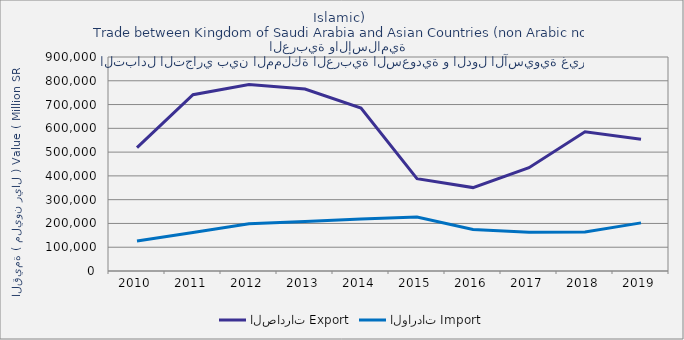
| Category | الصادرات | الواردات |
|---|---|---|
| 2010.0 | 518558255953 | 126340214000 |
| 2011.0 | 741564088895 | 161858633935 |
| 2012.0 | 784396925075 | 198437718217 |
| 2013.0 | 765253434045 | 207926807414 |
| 2014.0 | 685488904447 | 218830075159 |
| 2015.0 | 388133411072 | 227280076573 |
| 2016.0 | 350738691172 | 174404286684 |
| 2017.0 | 434618930097 | 162681670861 |
| 2018.0 | 585406686743 | 164250966196 |
| 2019.0 | 553658419145 | 202387462291 |